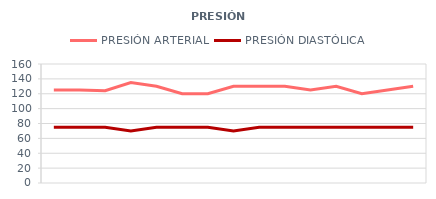
| Category | PRESIÓN ARTERIAL | PRESIÓN DIASTÓLICA |
|---|---|---|
| 6/1/12 | 125 | 75 |
| 6/2/12 | 125 | 75 |
| 6/3/12 | 124 | 75 |
| 6/4/12 | 135 | 70 |
| 6/5/12 | 130 | 75 |
| 6/6/12 | 120 | 75 |
| 6/7/12 | 120 | 75 |
| 6/8/12 | 130 | 70 |
| 6/9/12 | 130 | 75 |
| 6/10/12 | 130 | 75 |
| 6/11/12 | 125 | 75 |
| 6/12/12 | 130 | 75 |
| 6/13/12 | 120 | 75 |
| 6/14/12 | 125 | 75 |
| 6/15/12 | 130 | 75 |